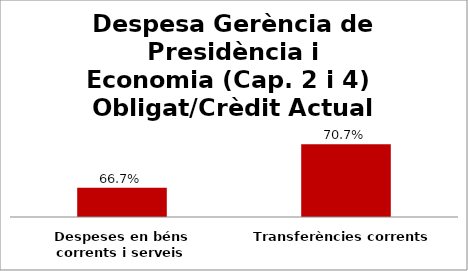
| Category | Series 0 |
|---|---|
| Despeses en béns corrents i serveis | 0.667 |
| Transferències corrents | 0.707 |